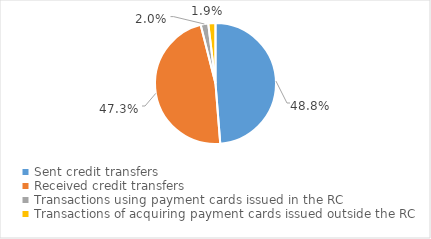
| Category | Series 0 |
|---|---|
| Sent credit transfers | 256926278539 |
| Received credit transfers | 249403513225 |
| Transactions using payment cards issued in the RC | 10674524281 |
| Transactions of acquiring payment cards issued outside the RC | 10130244903 |